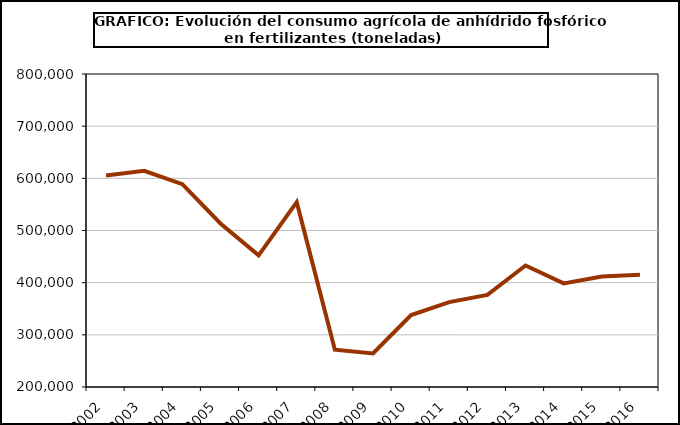
| Category | fertilizantes |
|---|---|
| 2002.0 | 605224 |
| 2003.0 | 614385 |
| 2004.0 | 588820 |
| 2005.0 | 513454 |
| 2006.0 | 452461 |
| 2007.0 | 554382 |
| 2008.0 | 271578 |
| 2009.0 | 264211 |
| 2010.0 | 337812 |
| 2011.0 | 362672 |
| 2012.0 | 376590 |
| 2013.0 | 432904 |
| 2014.0 | 398580 |
| 2015.0 | 411763 |
| 2016.0 | 414974 |